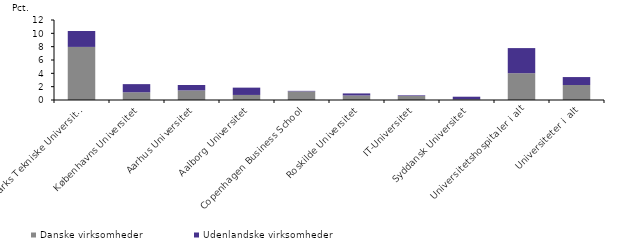
| Category | Danske virksomheder | Udenlandske virksomheder |
|---|---|---|
| Danmarks Tekniske Universitet | 7.963 | 2.392 |
| Københavns Universitet | 1.16 | 1.219 |
| Aarhus Universitet | 1.435 | 0.819 |
| Aalborg Universitet | 0.758 | 1.097 |
| Copenhagen Business School | 1.296 | 0.074 |
| Roskilde Universitet | 0.68 | 0.306 |
| IT-Universitet | 0.607 | 0.094 |
| Syddansk Universitet | 0.107 | 0.387 |
| Universitetshospitaler i alt | 4.02 | 3.765 |
| Universiteter i alt | 2.254 | 1.187 |